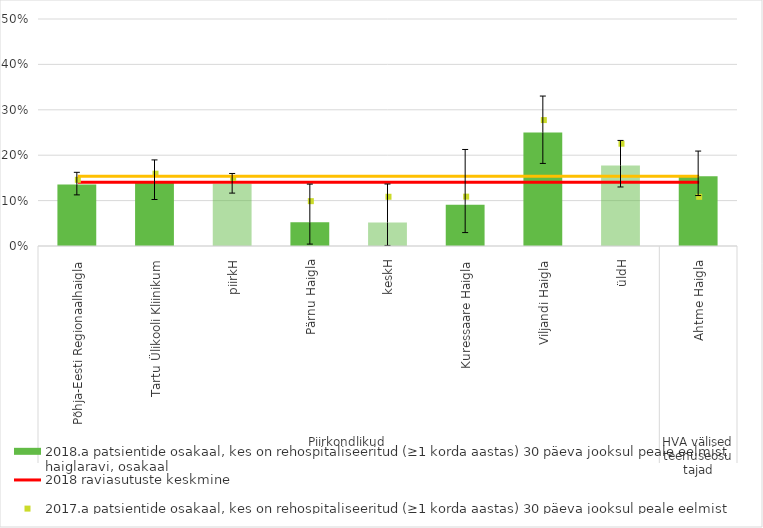
| Category | 2018.a patsientide osakaal, kes on rehospitaliseeritud (≥1 korda aastas) 30 päeva jooksul peale eelmist haiglaravi, osakaal |
|---|---|
| 0 | 0.136 |
| 1 | 0.141 |
| 2 | 0.137 |
| 3 | 0.052 |
| 4 | 0.052 |
| 5 | 0.091 |
| 6 | 0.25 |
| 7 | 0.177 |
| 8 | 0.154 |